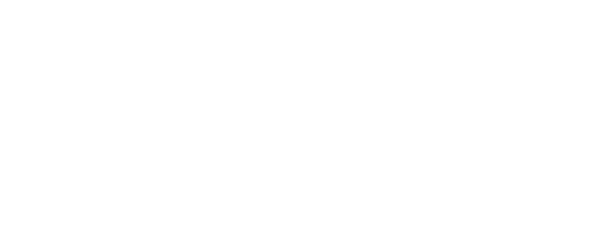
| Category | Total |
|---|---|
| Car | 7500 |
| Bonds | 11000 |
| Stocks | 15000 |
| Savings | 25000 |
| 401k | 55000 |
| House | 250000 |